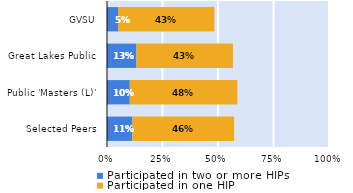
| Category | Participated in two or more HIPs | Participated in one HIP |
|---|---|---|
| Selected Peers | 0.114 | 0.458 |
| Public 'Masters (L)' | 0.103 | 0.485 |
| Great Lakes Public | 0.133 | 0.435 |
| GVSU | 0.05 | 0.434 |